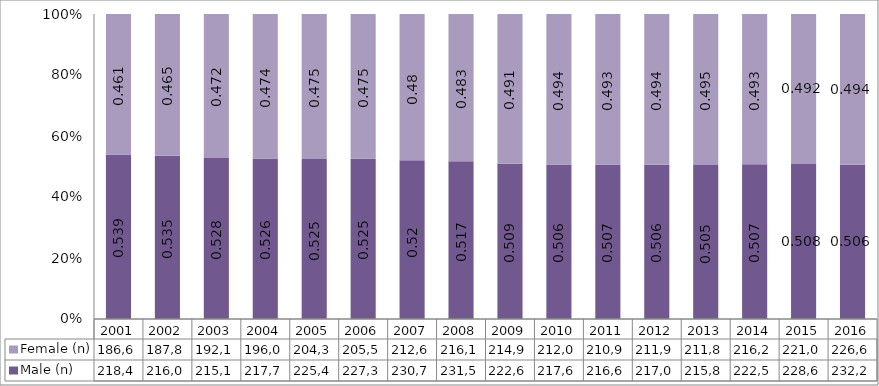
| Category | Male (n) | Female (n) |
|---|---|---|
| 2001.0 | 218437 | 186672 |
| 2002.0 | 216010 | 187834 |
| 2003.0 | 215177 | 192178 |
| 2004.0 | 217766 | 196043 |
| 2005.0 | 225443 | 204369 |
| 2006.0 | 227384 | 205522 |
| 2007.0 | 230786 | 212675 |
| 2008.0 | 231502 | 216152 |
| 2009.0 | 222618 | 214986 |
| 2010.0 | 217651 | 212068 |
| 2011.0 | 216683 | 210992 |
| 2012.0 | 217053 | 211956 |
| 2013.0 | 215848 | 211872 |
| 2014.0 | 222552 | 216215 |
| 2015.0 | 228638 | 221082 |
| 2016.0 | 232205 | 226600 |